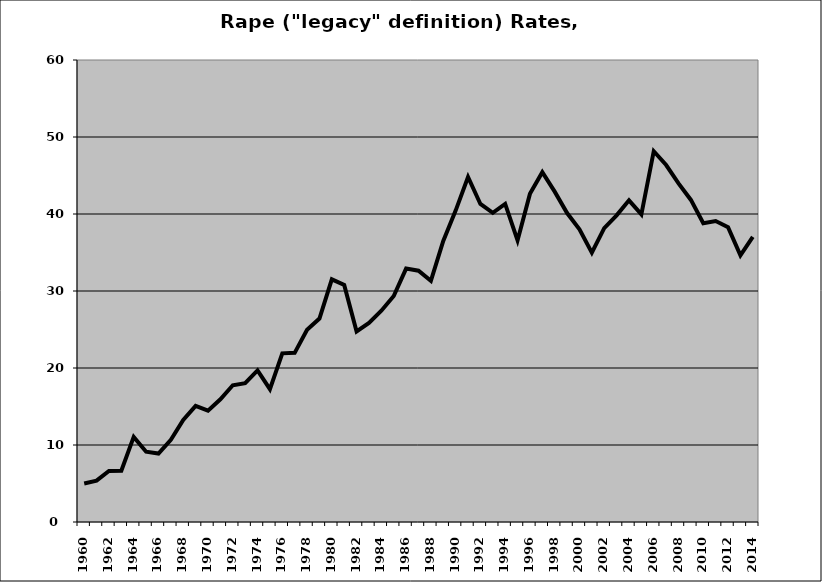
| Category | Rape |
|---|---|
| 1960.0 | 5.003 |
| 1961.0 | 5.378 |
| 1962.0 | 6.625 |
| 1963.0 | 6.652 |
| 1964.0 | 11.056 |
| 1965.0 | 9.132 |
| 1966.0 | 8.889 |
| 1967.0 | 10.681 |
| 1968.0 | 13.244 |
| 1969.0 | 15.08 |
| 1970.0 | 14.45 |
| 1971.0 | 15.943 |
| 1972.0 | 17.759 |
| 1973.0 | 18.034 |
| 1974.0 | 19.692 |
| 1975.0 | 17.247 |
| 1976.0 | 21.905 |
| 1977.0 | 21.969 |
| 1978.0 | 24.957 |
| 1979.0 | 26.425 |
| 1980.0 | 31.51 |
| 1981.0 | 30.785 |
| 1982.0 | 24.751 |
| 1983.0 | 25.856 |
| 1984.0 | 27.441 |
| 1985.0 | 29.347 |
| 1986.0 | 32.913 |
| 1987.0 | 32.633 |
| 1988.0 | 31.323 |
| 1989.0 | 36.49 |
| 1990.0 | 40.443 |
| 1991.0 | 44.81 |
| 1992.0 | 41.3 |
| 1993.0 | 40.142 |
| 1994.0 | 41.308 |
| 1995.0 | 36.569 |
| 1996.0 | 42.613 |
| 1997.0 | 45.434 |
| 1998.0 | 42.906 |
| 1999.0 | 40.127 |
| 2000.0 | 38.015 |
| 2001.0 | 34.972 |
| 2002.0 | 38.167 |
| 2003.0 | 39.82 |
| 2004.0 | 41.775 |
| 2005.0 | 39.954 |
| 2006.0 | 48.154 |
| 2007.0 | 46.362 |
| 2008.0 | 43.97 |
| 2009.0 | 41.827 |
| 2010.0 | 38.8 |
| 2011.0 | 39.089 |
| 2012.0 | 38.296 |
| 2013.0 | 34.636 |
| 2014.0 | 37.018 |